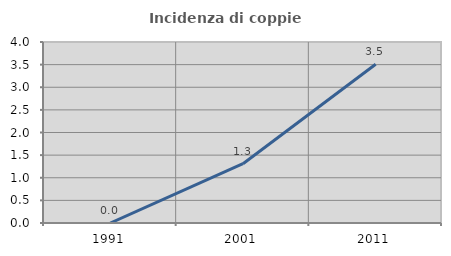
| Category | Incidenza di coppie miste |
|---|---|
| 1991.0 | 0 |
| 2001.0 | 1.31 |
| 2011.0 | 3.507 |